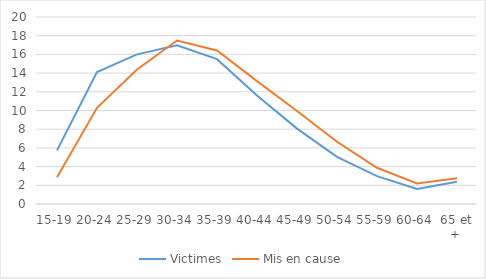
| Category | Victimes | Mis en cause |
|---|---|---|
| 15-19 | 5.736 | 2.858 |
| 20-24 | 14.121 | 10.284 |
| 25-29 | 16.003 | 14.381 |
| 30-34 | 16.963 | 17.485 |
| 35-39 | 15.492 | 16.414 |
| 40-44 | 11.614 | 13.137 |
| 45-49 | 8.061 | 9.942 |
| 50-54 | 5.034 | 6.655 |
| 55-59 | 2.98 | 3.873 |
| 60-64 | 1.619 | 2.206 |
| 65 et + | 2.376 | 2.764 |